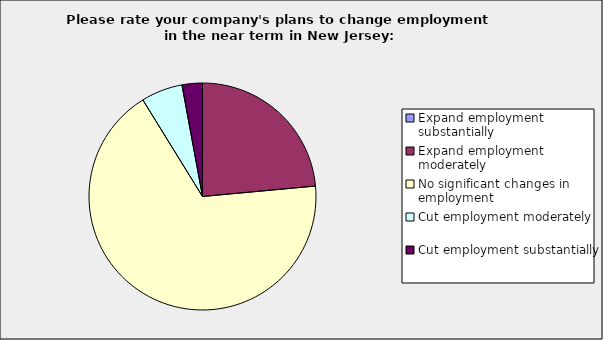
| Category | Series 0 |
|---|---|
| Expand employment substantially | 0 |
| Expand employment moderately | 0.235 |
| No significant changes in employment | 0.676 |
| Cut employment moderately | 0.059 |
| Cut employment substantially | 0.029 |